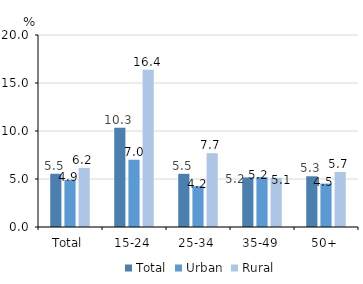
| Category | Total | Urban | Rural |
|---|---|---|---|
| Total | 5.545 | 4.897 | 6.156 |
| 15-24 | 10.348 | 7.007 | 16.378 |
| 25-34 | 5.54 | 4.247 | 7.686 |
| 35-49 | 5.164 | 5.202 | 5.128 |
| 50+ | 5.283 | 4.518 | 5.735 |